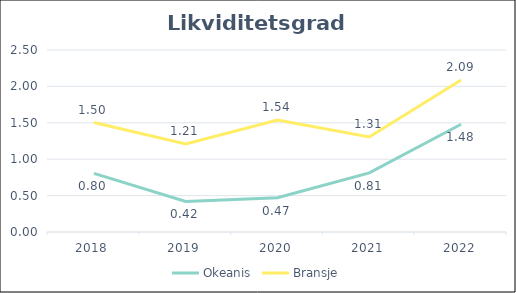
| Category | Okeanis | Bransje |
|---|---|---|
| 2018 | 0.805 | 1.503 |
| 2019 | 0.419 | 1.211 |
| 2020 | 0.472 | 1.539 |
| 2021 | 0.812 | 1.306 |
| 2022 | 1.48 | 2.089 |